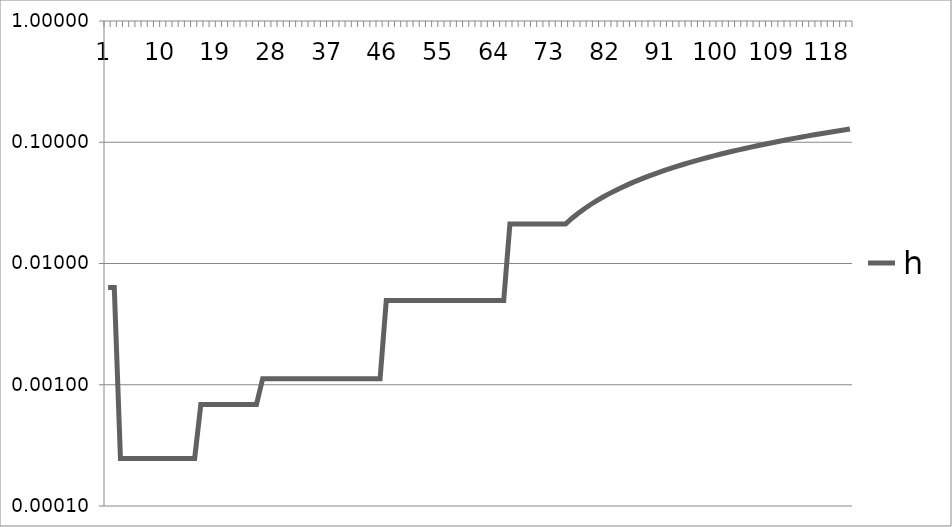
| Category | h |
|---|---|
| 0 | 0.006 |
| 1 | 0.006 |
| 2 | 0 |
| 3 | 0 |
| 4 | 0 |
| 5 | 0 |
| 6 | 0 |
| 7 | 0 |
| 8 | 0 |
| 9 | 0 |
| 10 | 0 |
| 11 | 0 |
| 12 | 0 |
| 13 | 0 |
| 14 | 0 |
| 15 | 0.001 |
| 16 | 0.001 |
| 17 | 0.001 |
| 18 | 0.001 |
| 19 | 0.001 |
| 20 | 0.001 |
| 21 | 0.001 |
| 22 | 0.001 |
| 23 | 0.001 |
| 24 | 0.001 |
| 25 | 0.001 |
| 26 | 0.001 |
| 27 | 0.001 |
| 28 | 0.001 |
| 29 | 0.001 |
| 30 | 0.001 |
| 31 | 0.001 |
| 32 | 0.001 |
| 33 | 0.001 |
| 34 | 0.001 |
| 35 | 0.001 |
| 36 | 0.001 |
| 37 | 0.001 |
| 38 | 0.001 |
| 39 | 0.001 |
| 40 | 0.001 |
| 41 | 0.001 |
| 42 | 0.001 |
| 43 | 0.001 |
| 44 | 0.001 |
| 45 | 0.005 |
| 46 | 0.005 |
| 47 | 0.005 |
| 48 | 0.005 |
| 49 | 0.005 |
| 50 | 0.005 |
| 51 | 0.005 |
| 52 | 0.005 |
| 53 | 0.005 |
| 54 | 0.005 |
| 55 | 0.005 |
| 56 | 0.005 |
| 57 | 0.005 |
| 58 | 0.005 |
| 59 | 0.005 |
| 60 | 0.005 |
| 61 | 0.005 |
| 62 | 0.005 |
| 63 | 0.005 |
| 64 | 0.005 |
| 65 | 0.021 |
| 66 | 0.021 |
| 67 | 0.021 |
| 68 | 0.021 |
| 69 | 0.021 |
| 70 | 0.021 |
| 71 | 0.021 |
| 72 | 0.021 |
| 73 | 0.021 |
| 74 | 0.021 |
| 75 | 0.024 |
| 76 | 0.026 |
| 77 | 0.028 |
| 78 | 0.031 |
| 79 | 0.033 |
| 80 | 0.035 |
| 81 | 0.038 |
| 82 | 0.04 |
| 83 | 0.042 |
| 84 | 0.045 |
| 85 | 0.047 |
| 86 | 0.049 |
| 87 | 0.052 |
| 88 | 0.054 |
| 89 | 0.056 |
| 90 | 0.059 |
| 91 | 0.061 |
| 92 | 0.063 |
| 93 | 0.066 |
| 94 | 0.068 |
| 95 | 0.07 |
| 96 | 0.073 |
| 97 | 0.075 |
| 98 | 0.077 |
| 99 | 0.08 |
| 100 | 0.082 |
| 101 | 0.084 |
| 102 | 0.087 |
| 103 | 0.089 |
| 104 | 0.091 |
| 105 | 0.094 |
| 106 | 0.096 |
| 107 | 0.098 |
| 108 | 0.101 |
| 109 | 0.103 |
| 110 | 0.105 |
| 111 | 0.108 |
| 112 | 0.11 |
| 113 | 0.112 |
| 114 | 0.115 |
| 115 | 0.117 |
| 116 | 0.119 |
| 117 | 0.122 |
| 118 | 0.124 |
| 119 | 0.126 |
| 120 | 0.129 |